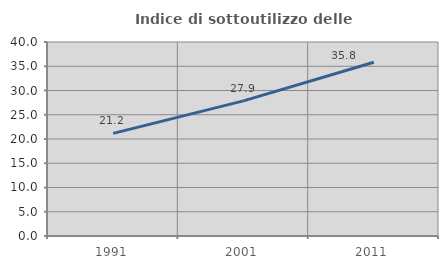
| Category | Indice di sottoutilizzo delle abitazioni  |
|---|---|
| 1991.0 | 21.168 |
| 2001.0 | 27.854 |
| 2011.0 | 35.817 |